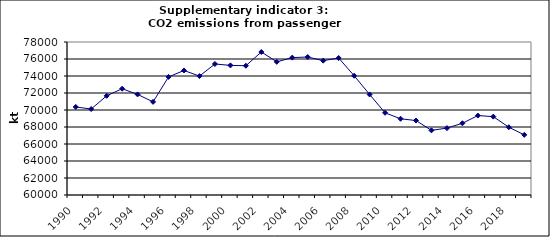
| Category | CO2 emissions from passenger cars, kt |
|---|---|
| 1990 | 70358.041 |
| 1991 | 70114 |
| 1992 | 71668.041 |
| 1993 | 72501.107 |
| 1994 | 71835.809 |
| 1995 | 70955.541 |
| 1996 | 73891.24 |
| 1997 | 74648.929 |
| 1998 | 73989.268 |
| 1999 | 75415.258 |
| 2000 | 75247.17 |
| 2001 | 75209.431 |
| 2002 | 76821.946 |
| 2003 | 75667.06 |
| 2004 | 76163.276 |
| 2005 | 76233.76 |
| 2006 | 75804.498 |
| 2007 | 76116.893 |
| 2008 | 74029.567 |
| 2009 | 71829.27 |
| 2010 | 69670.069 |
| 2011 | 68967.541 |
| 2012 | 68757.414 |
| 2013 | 67605.267 |
| 2014 | 67870.03 |
| 2015 | 68439.867 |
| 2016 | 69345.027 |
| 2017 | 69219.805 |
| 2018 | 67973.59 |
| 2019 | 67077.544 |